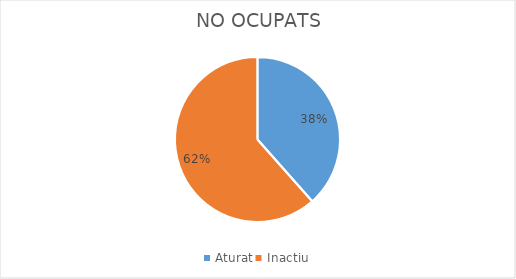
| Category | Series 0 |
|---|---|
| Aturat | 5 |
| Inactiu | 8 |